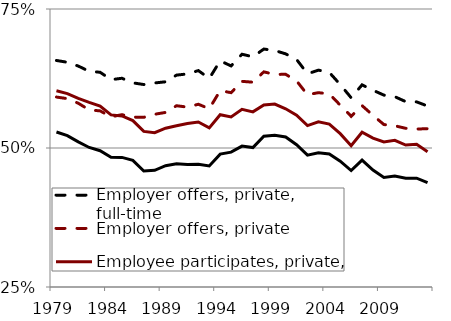
| Category | Employer offers, private, full-time | Employer offers, private | Employee participates, private, full-time | Employee participates, private |
|---|---|---|---|---|
| 1979.0 | 0.657 | 0.592 | 0.603 | 0.529 |
| 1980.0 | 0.654 | 0.589 | 0.598 | 0.522 |
| 1981.0 | 0.647 | 0.58 | 0.589 | 0.511 |
| 1982.0 | 0.638 | 0.569 | 0.582 | 0.501 |
| 1983.0 | 0.636 | 0.567 | 0.576 | 0.495 |
| 1984.0 | 0.623 | 0.556 | 0.56 | 0.483 |
| 1985.0 | 0.625 | 0.56 | 0.558 | 0.483 |
| 1986.0 | 0.617 | 0.556 | 0.549 | 0.478 |
| 1987.0 | 0.614 | 0.555 | 0.53 | 0.459 |
| 1988.0 | 0.617 | 0.561 | 0.527 | 0.46 |
| 1989.0 | 0.619 | 0.564 | 0.536 | 0.468 |
| 1990.0 | 0.631 | 0.576 | 0.54 | 0.472 |
| 1991.0 | 0.633 | 0.574 | 0.544 | 0.47 |
| 1992.0 | 0.639 | 0.579 | 0.547 | 0.471 |
| 1993.0 | 0.625 | 0.571 | 0.536 | 0.468 |
| 1994.0 | 0.657 | 0.603 | 0.56 | 0.489 |
| 1995.0 | 0.648 | 0.6 | 0.556 | 0.493 |
| 1996.0 | 0.669 | 0.62 | 0.57 | 0.503 |
| 1997.0 | 0.664 | 0.618 | 0.565 | 0.501 |
| 1998.0 | 0.678 | 0.637 | 0.578 | 0.521 |
| 1999.0 | 0.675 | 0.632 | 0.579 | 0.523 |
| 2000.0 | 0.669 | 0.632 | 0.57 | 0.52 |
| 2001.0 | 0.659 | 0.621 | 0.559 | 0.506 |
| 2002.0 | 0.634 | 0.596 | 0.54 | 0.487 |
| 2003.0 | 0.64 | 0.6 | 0.547 | 0.491 |
| 2004.0 | 0.636 | 0.597 | 0.543 | 0.489 |
| 2005.0 | 0.614 | 0.577 | 0.526 | 0.476 |
| 2006.0 | 0.59 | 0.557 | 0.504 | 0.46 |
| 2007.0 | 0.614 | 0.576 | 0.528 | 0.478 |
| 2008.0 | 0.604 | 0.559 | 0.518 | 0.46 |
| 2009.0 | 0.595 | 0.542 | 0.511 | 0.447 |
| 2010.0 | 0.592 | 0.54 | 0.514 | 0.45 |
| 2011.0 | 0.583 | 0.535 | 0.505 | 0.446 |
| 2012.0 | 0.583 | 0.534 | 0.507 | 0.446 |
| 2013.0 | 0.576 | 0.535 | 0.493 | 0.438 |